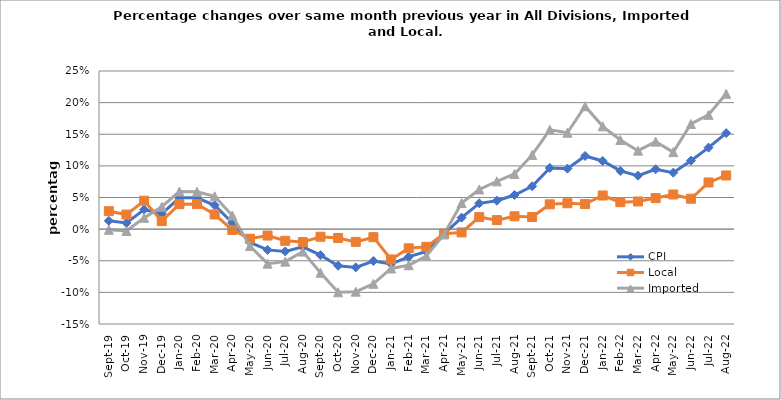
| Category | CPI | Local | Imported |
|---|---|---|---|
| 2019-09-01 | 0.013 | 0.028 | -0.001 |
| 2019-10-01 | 0.01 | 0.023 | -0.003 |
| 2019-11-01 | 0.031 | 0.045 | 0.018 |
| 2019-12-01 | 0.024 | 0.013 | 0.035 |
| 2020-01-01 | 0.049 | 0.039 | 0.059 |
| 2020-02-01 | 0.05 | 0.04 | 0.059 |
| 2020-03-01 | 0.038 | 0.023 | 0.052 |
| 2020-04-01 | 0.01 | -0.001 | 0.021 |
| 2020-05-01 | -0.021 | -0.015 | -0.027 |
| 2020-06-01 | -0.033 | -0.01 | -0.055 |
| 2020-07-01 | -0.035 | -0.018 | -0.051 |
| 2020-08-01 | -0.028 | -0.02 | -0.036 |
| 2020-09-01 | -0.041 | -0.012 | -0.069 |
| 2020-10-01 | -0.058 | -0.014 | -0.1 |
| 2020-11-01 | -0.06 | -0.02 | -0.099 |
| 2020-12-01 | -0.05 | -0.013 | -0.086 |
| 2021-01-01 | -0.055 | -0.048 | -0.062 |
| 2021-02-01 | -0.044 | -0.03 | -0.057 |
| 2021-03-01 | -0.035 | -0.028 | -0.043 |
| 2021-04-01 | -0.008 | -0.007 | -0.008 |
| 2021-05-01 | 0.018 | -0.005 | 0.041 |
| 2021-06-01 | 0.041 | 0.019 | 0.063 |
| 2021-07-01 | 0.045 | 0.014 | 0.075 |
| 2021-08-01 | 0.054 | 0.02 | 0.087 |
| 2021-09-01 | 0.068 | 0.019 | 0.117 |
| 2021-10-01 | 0.097 | 0.039 | 0.157 |
| 2021-11-01 | 0.096 | 0.041 | 0.152 |
| 2021-12-01 | 0.116 | 0.04 | 0.194 |
| 2022-01-01 | 0.108 | 0.053 | 0.163 |
| 2022-02-01 | 0.092 | 0.043 | 0.141 |
| 2022-03-01 | 0.085 | 0.044 | 0.124 |
| 2022-04-01 | 0.095 | 0.049 | 0.138 |
| 2022-05-01 | 0.089 | 0.055 | 0.122 |
| 2022-06-01 | 0.108 | 0.048 | 0.166 |
| 2022-07-01 | 0.129 | 0.074 | 0.181 |
| 2022-08-01 | 0.152 | 0.085 | 0.214 |